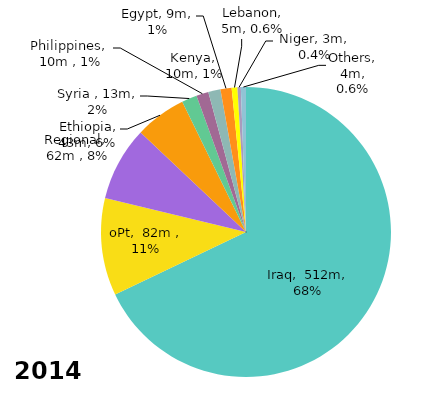
| Category | US$ millions |
|---|---|
| Iraq | 512.378 |
| oPt | 81.981 |
| Regional | 62.47 |
| Ethiopia | 43.04 |
| Syria  | 12.809 |
| Philippines | 10.262 |
| Kenya | 10.248 |
| Egypt | 9.39 |
| Lebanon | 4.844 |
| Niger | 2.818 |
| Others | 4.28 |